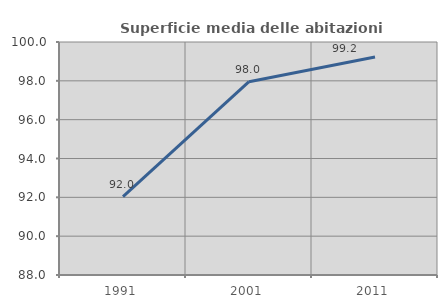
| Category | Superficie media delle abitazioni occupate |
|---|---|
| 1991.0 | 92.033 |
| 2001.0 | 97.955 |
| 2011.0 | 99.229 |